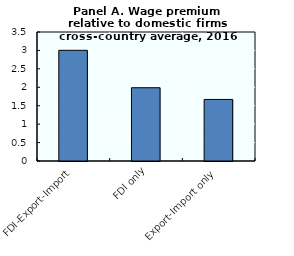
| Category | Wage premium to domestic firms |
|---|---|
| FDI-Export-Import | 3.003 |
| FDI only | 1.988 |
| Export-Import only | 1.67 |